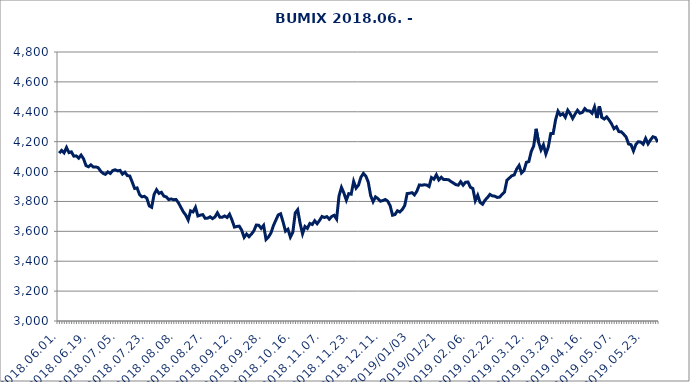
| Category | BUMIX |
|---|---|
| 2018.06.01. | 4122.878 |
| 2018.06.04. | 4141.465 |
| 2018.06.05. | 4125.523 |
| 2018.06.06. | 4161.125 |
| 2018.06.07. | 4126.788 |
| 2018.06.08. | 4131.751 |
| 2018.06.11. | 4103.042 |
| 2018.06.12. | 4104.921 |
| 2018.06.13. | 4089.586 |
| 2018.06.14. | 4110.218 |
| 2018.06.15. | 4085.311 |
| 2018.06.18. | 4040.321 |
| 2018.06.19. | 4031.899 |
| 2018.06.20. | 4045.043 |
| 2018.06.21. | 4030.651 |
| 2018.06.22. | 4031.159 |
| 2018.06.25. | 4026.075 |
| 2018.06.26. | 4003.752 |
| 2018.06.27. | 3987.906 |
| 2018.06.28. | 3981.143 |
| 2018.06.29. | 3997.712 |
| 2018.07.02. | 3987.338 |
| 2018.07.03. | 4006.859 |
| 2018.07.04. | 4012.003 |
| 2018.07.05. | 4004.506 |
| 2018.07.06. | 4007.625 |
| 2018.07.09. | 3982.976 |
| 2018.07.10. | 3995.676 |
| 2018.07.11. | 3972.701 |
| 2018.07.12. | 3970.181 |
| 2018.07.13. | 3929.383 |
| 2018.07.16. | 3886.794 |
| 2018.07.17. | 3890.475 |
| 2018.07.18. | 3846.792 |
| 2018.07.19. | 3830.922 |
| 2018.07.20. | 3834.346 |
| 2018.07.23. | 3822.015 |
| 2018.07.24. | 3770.084 |
| 2018.07.25. | 3760.84 |
| 2018.07.26. | 3847.267 |
| 2018.07.27. | 3878.207 |
| 2018.07.30. | 3853.756 |
| 2018.07.31. | 3861.27 |
| 2018.08.01. | 3835.511 |
| 2018.08.02. | 3830.772 |
| 2018.08.03. | 3812.434 |
| 2018.08.06. | 3816.829 |
| 2018.08.07. | 3811.577 |
| 2018.08.08. | 3813.431 |
| 2018.08.09. | 3791.061 |
| 2018.08.10. | 3760.819 |
| 2018.08.13. | 3730.654 |
| 2018.08.14. | 3709.031 |
| 2018.08.15. | 3675.931 |
| 2018.08.16. | 3737.134 |
| 2018.08.17. | 3729.779 |
| 2018.08.21. | 3760.588 |
| 2018.08.22. | 3702.653 |
| 2018.08.23. | 3708.239 |
| 2018.08.24. | 3711.978 |
| 2018.08.27. | 3686.841 |
| 2018.08.28. | 3688.514 |
| 2018.08.29. | 3697.179 |
| 2018.08.30. | 3685.145 |
| 2018.08.31. | 3696.137 |
| 2018.09.03. | 3723.998 |
| 2018.09.04. | 3694.873 |
| 2018.09.05. | 3694.26 |
| 2018.09.06. | 3702.708 |
| 2018.09.07. | 3692.48 |
| 2018.09.10. | 3714.613 |
| 2018.09.11. | 3676.015 |
| 2018.09.12. | 3628.118 |
| 2018.09.13. | 3632.751 |
| 2018.09.14. | 3634.595 |
| 2018.09.17. | 3607.525 |
| 2018.09.18. | 3559.415 |
| 2018.09.19. | 3581.791 |
| 2018.09.20. | 3564.331 |
| 2018.09.21. | 3581.571 |
| 2018.09.24. | 3603.623 |
| 2018.09.25. | 3642.359 |
| 2018.09.26. | 3640.704 |
| 2018.09.27. | 3620.046 |
| 2018.09.28. | 3639.962 |
| 2018.10.01. | 3545.225 |
| 2018.10.02. | 3562.111 |
| 2018.10.03. | 3588.536 |
| 2018.10.04. | 3636.71 |
| 2018.10.05. | 3673.841 |
| 2018.10.08. | 3709.52 |
| 2018.10.09. | 3717.358 |
| 2018.10.10. | 3662.751 |
| 2018.10.11. | 3600.943 |
| 2018.10.12. | 3614.019 |
| 2018.10.15. | 3561.302 |
| 2018.10.16. | 3592.865 |
| 2018.10.17. | 3723.184 |
| 2018.10.18. | 3744.968 |
| 2018.10.19. | 3654.096 |
| 2018.10.24. | 3583.887 |
| 2018.10.25. | 3632.712 |
| 2018.10.26. | 3619.697 |
| 2018.10.29. | 3652.822 |
| 2018.10.30. | 3645.782 |
| 2018.10.31. | 3670.978 |
| 2018.11.05. | 3650.792 |
| 2018.11.06. | 3673.183 |
| 2018.11.07. | 3699.469 |
| 2018.11.08. | 3692.504 |
| 2018.11.09. | 3698.783 |
| 2018.11.12. | 3681.173 |
| 2018.11.13. | 3699.645 |
| 2018.11.14. | 3707.372 |
| 2018.11.15. | 3682.115 |
| 2018.11.16. | 3837.757 |
| 2018.11.19. | 3894.032 |
| 2018.11.20. | 3856.216 |
| 2018.11.21. | 3808.211 |
| 2018.11.22. | 3852.314 |
| 2018.11.23. | 3848.656 |
| 2018.11.26. | 3934.195 |
| 2018.11.27. | 3888.885 |
| 2018.11.28. | 3909.193 |
| 2018.11.29. | 3962.139 |
| 2018.11.30. | 3987.244 |
| 2018.12.03. | 3970.463 |
| 2018.12.04. | 3930.053 |
| 2018.12.05. | 3838.939 |
| 2018.12.06. | 3797.914 |
| 2018.12.07. | 3830.508 |
| 2018.12.10. | 3819.07 |
| 2018.12.11. | 3801.516 |
| 2018.12.12. | 3806.111 |
| 2018.12.13. | 3813.089 |
| 2018.12.14. | 3801.977 |
| 2018.12.17. | 3771.577 |
| 2018.12.18. | 3707.857 |
| 2018.12.19. | 3712.394 |
| 2018.12.20. | 3737.593 |
| 2018.12.21. | 3729.391 |
| 2018.12.27. | 3746.165 |
| 2018.12.28. | 3772.989 |
| 2019.01.02 | 3852.696 |
| 2019.01.03 | 3854.768 |
| 2019.01.04 | 3858.819 |
| 2019.01.07 | 3843.736 |
| 2019.01.08 | 3868.963 |
| 2019.01.09 | 3910.514 |
| 2019.01.10 | 3908.284 |
| 2019.01.11 | 3911.458 |
| 2019.01.14 | 3910.145 |
| 2019.01.15 | 3899.917 |
| 2019.01.16 | 3959.985 |
| 2019.01.17 | 3948.871 |
| 2019.01.18 | 3978.416 |
| 2019.01.21 | 3943.789 |
| 2019.01.22 | 3961.664 |
| 2019.01.23 | 3946.582 |
| 2019.01.24 | 3946.385 |
| 2019.01.25 | 3945.542 |
| 2019.01.28 | 3933.29 |
| 2019.01.29 | 3923.447 |
| 2019.01.30 | 3912.29 |
| 2019.01.31 | 3908.703 |
| 2019.02.01. | 3932.266 |
| 2019.02.04. | 3908.966 |
| 2019.02.05. | 3928.475 |
| 2019.02.06. | 3930.105 |
| 2019.02.07. | 3894.439 |
| 2019.02.08. | 3886.598 |
| 2019.02.11. | 3805.063 |
| 2019.02.12. | 3841.386 |
| 2019.02.13. | 3793.076 |
| 2019.02.14. | 3781.398 |
| 2019.02.15. | 3808.701 |
| 2019.02.18. | 3825.648 |
| 2019.02.19. | 3847.234 |
| 2019.02.20. | 3837.369 |
| 2019.02.21. | 3835.436 |
| 2019.02.22. | 3826.772 |
| 2019.02.25. | 3828.913 |
| 2019.02.26. | 3846.929 |
| 2019.02.27. | 3863.049 |
| 2019.02.28. | 3942.258 |
| 2019.03.01. | 3956.935 |
| 2019.03.04. | 3971.481 |
| 2019.03.05. | 3977.621 |
| 2019.03.06. | 4016.821 |
| 2019.03.07. | 4041.183 |
| 2019.03.08. | 3989.92 |
| 2019.03.11. | 4006.147 |
| 2019.03.12. | 4061.718 |
| 2019.03.13. | 4066.72 |
| 2019.03.14. | 4134.52 |
| 2019.03.18. | 4171.26 |
| 2019.03.19. | 4285.915 |
| 2019.03.20. | 4196.324 |
| 2019.03.21. | 4144.948 |
| 2019.03.22. | 4179.111 |
| 2019.03.25. | 4117.803 |
| 2019.03.26. | 4163.571 |
| 2019.03.27. | 4253.956 |
| 2019.03.28. | 4254.83 |
| 2019.03.29. | 4346.223 |
| 2019.04.01. | 4404.188 |
| 2019.04.02. | 4377.333 |
| 2019.04.03. | 4387.356 |
| 2019.04.04. | 4363.232 |
| 2019.04.05. | 4410.606 |
| 2019.04.08. | 4387.404 |
| 2019.04.09. | 4355.229 |
| 2019.04.10. | 4384.177 |
| 2019.04.11. | 4409.897 |
| 2019.04.12. | 4390.358 |
| 2019.04.15. | 4395.658 |
| 2019.04.16. | 4421.303 |
| 2019.04.17. | 4406.629 |
| 2019.04.18. | 4405.672 |
| 2019.04.23. | 4390.102 |
| 2019.04.24. | 4432.755 |
| 2019.04.25. | 4358.305 |
| 2019.04.26. | 4436.215 |
| 2019.04.29. | 4362.069 |
| 2019.04.30. | 4351.191 |
| 2019.05.02. | 4365.66 |
| 2019.05.03. | 4344.454 |
| 2019.05.06. | 4319.386 |
| 2019.05.07. | 4286.74 |
| 2019.05.08. | 4299.692 |
| 2019.05.09. | 4267.243 |
| 2019.05.10. | 4266.527 |
| 2019.05.13. | 4249.324 |
| 2019.05.14. | 4230.907 |
| 2019.05.15. | 4184.385 |
| 2019.05.16. | 4179.726 |
| 2019.05.17. | 4137.848 |
| 2019.05.20. | 4181.669 |
| 2019.05.21. | 4199.779 |
| 2019.05.22. | 4197.152 |
| 2019.05.23. | 4183.188 |
| 2019.05.24. | 4221.728 |
| 2019.05.27. | 4185.532 |
| 2019.05.28. | 4211.345 |
| 2019.05.29. | 4233.062 |
| 2019.05.30. | 4227.658 |
| 2019.05.31. | 4196.665 |